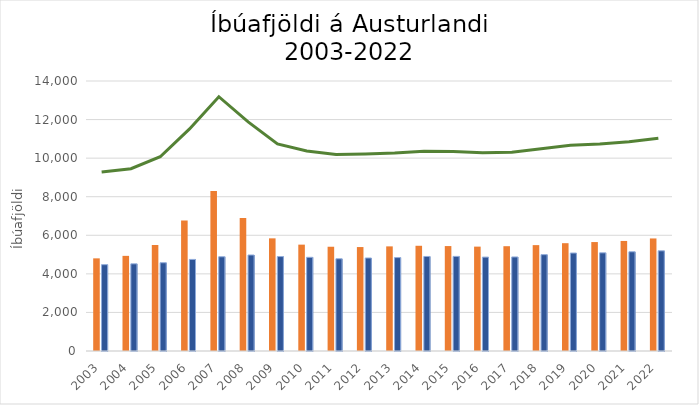
| Category | Karlar | Konur |
|---|---|---|
| 2003.0 | 4804 | 4476 |
| 2004.0 | 4933 | 4520 |
| 2005.0 | 5497 | 4576 |
| 2006.0 | 6768 | 4748 |
| 2007.0 | 8298 | 4887 |
| 2008.0 | 6900 | 4977 |
| 2009.0 | 5841 | 4896 |
| 2010.0 | 5515 | 4858 |
| 2011.0 | 5406 | 4781 |
| 2012.0 | 5390 | 4823 |
| 2013.0 | 5425 | 4843 |
| 2014.0 | 5456 | 4901 |
| 2015.0 | 5441 | 4905 |
| 2016.0 | 5412 | 4869 |
| 2017.0 | 5434 | 4876 |
| 2018.0 | 5490 | 4995 |
| 2019.0 | 5590 | 5080 |
| 2020.0 | 5649 | 5090 |
| 2021.0 | 5706 | 5144 |
| 2022.0 | 5836 | 5195 |